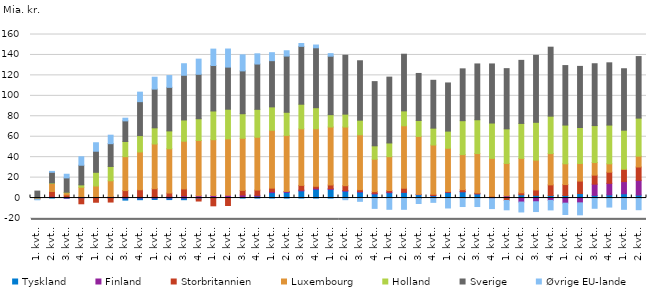
| Category | Tyskland | Finland | Storbritannien | Luxembourg | Holland | Sverige | Øvrige EU-lande |
|---|---|---|---|---|---|---|---|
| 1. kvt. 05 | -0.1 | -0.2 | -0.9 | 0.1 | 0.2 | 6.5 | -0.5 |
| 2. kvt. 05 | 0.6 | 1.2 | 4.6 | 7.9 | 0.5 | 10.4 | 0.9 |
| 3. kvt. 05 | -0.2 | 0.9 | 2.1 | 2.2 | 0.5 | 14 | 3.6 |
| 4. kvt. 05 | -0.7 | 1 | -4.9 | 9.6 | 2.3 | 19.2 | 8.3 |
| 1. kvt. 06 | -0.1 | 1.1 | -4 | 10.7 | 13.4 | 20.6 | 8.3 |
| 2. kvt. 06 | 0.1 | 1.4 | -3.9 | 15.4 | 14 | 22.3 | 8.3 |
| 3. kvt. 06 | -2 | 1.4 | 5.9 | 33.2 | 14.8 | 20.2 | 2.6 |
| 4. kvt. 06 | -1.6 | 1.5 | 6.6 | 37 | 16 | 33.2 | 9.3 |
| 1. kvt. 07 | -1.4 | 1.3 | 7.8 | 43.8 | 15.8 | 37.9 | 11.6 |
| 2. kvt. 07 | -1.5 | 1.7 | 3.2 | 43.3 | 17.5 | 42.6 | 11.5 |
| 3. kvt. 07 | -1.6 | 2.3 | 6.6 | 46.7 | 20.8 | 43.7 | 11.3 |
| 4. kvt. 07 | -0.9 | 2.3 | -2 | 54 | 21.3 | 43.5 | 14.8 |
| 1. kvt. 08 | 0.2 | 2.3 | -7.6 | 54.6 | 28.1 | 44.5 | 16 |
| 2. kvt. 08 | 0.6 | 2.1 | -7.3 | 55.2 | 29 | 41.2 | 17.7 |
| 3. kvt. 08 | 0.7 | 2.3 | 4.5 | 51 | 24 | 41.9 | 15.7 |
| 4. kvt. 08 | 1.8 | 0.9 | 5.1 | 51.7 | 27.3 | 44.3 | 10 |
| 1. kvt. 09 | 5.3 | 1 | 3.4 | 56.6 | 22.9 | 45.2 | 7.8 |
| 2. kvt. 09 | 5.6 | 0.8 | 0.1 | 54.8 | 22.6 | 55 | 5.2 |
| 3. kvt. 09 | 7 | 0.8 | 4.6 | 55.3 | 24.1 | 56.6 | 2.8 |
| 4. kvt. 09 | 8.6 | 1 | 1.9 | 56.3 | 20.6 | 58.6 | 2.7 |
| 1. kvt. 10 | 8.5 | 0.7 | 3.6 | 56.7 | 12.1 | 57.2 | 2.5 |
| 2. kvt. 10 | 6.7 | 0.7 | 4.7 | 57.4 | 12.6 | 57.6 | -1.6 |
| 3. kvt. 10 | 5.8 | 0.6 | 1.8 | 53.7 | 14.3 | 58.1 | -3.2 |
| 4. kvt. 10 | 4 | 0.6 | 1.7 | 31.7 | 13.1 | 62.8 | -10.1 |
| 1. kvt. 11 | 5.2 | 0.7 | 1.5 | 33.1 | 13.4 | 64.4 | -11 |
| 2. kvt. 11 | 5.5 | 0.2 | 3.9 | 61.1 | 14.6 | 55.4 | -11 |
| 3. kvt. 11 | 3.3 | 0.3 | -0.3 | 56.7 | 15.6 | 46 | -5 |
| 4. kvt. 11 | 2.3 | 0.2 | 1.2 | 48.2 | 16.5 | 46.8 | -4.2 |
| 1. kvt. 12 | 5.6 | 0.2 | 0.6 | 42.3 | 16.8 | 47.1 | -9.7 |
| 2. kvt. 12 | 6.1 | 0.2 | 1.9 | 34.3 | 33.2 | 50.7 | -8.3 |
| 3. kvt. 12 | 4.1 | 0.1 | 0.8 | 38.5 | 33.1 | 54.6 | -8.3 |
| 4. kvt. 12 | 1 | -0.6 | 0.8 | 37 | 34.6 | 57.8 | -9.7 |
| 1. kvt. 13 | 0.7 | 1.5 | -2.4 | 31.7 | 33.8 | 58.9 | -9.1 |
| 2. kvt. 13 | 3.2 | -3.9 | 1.9 | 33.7 | 34.2 | 61.7 | -9.7 |
| 3. kvt. 13 | 2.6 | -3.6 | 5.3 | 29.2 | 37 | 65.5 | -9.6 |
| 4. kvt. 13 | 2.5 | -2.3 | 10.4 | 30.6 | 36.6 | 67.5 | -9.3 |
| 1. kvt. 14 | 2.5 | -5 | 10.7 | 20.3 | 37.9 | 58.2 | -11.1 |
| 2. kvt. 14 | 4.4 | -4.7 | 12.2 | 17.2 | 35.2 | 59.8 | -11.7 |
| 3. kvt. 14 | 2.6 | 11 | 8.8 | 12.4 | 36.1 | 60.5 | -10 |
| 4. kvt. 14 | 3.1 | 11.3 | 10.9 | 8.2 | 37.9 | 60.9 | -8.8 |
| 1. kvt. 15 | 4.2 | 11.9 | 12 | 0.3 | 38 | 60.1 | -11 |
| 2. kvt. 15 | 2.9 | 14.5 | 13 | 10.6 | 37.2 | 60.2 | -11.4 |